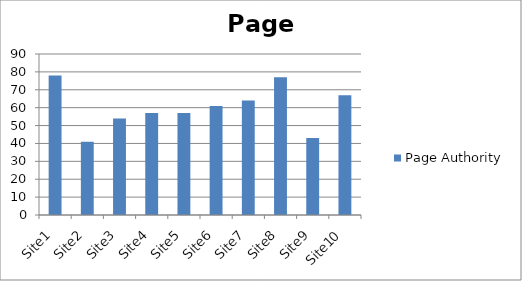
| Category | Page Authority |
|---|---|
| Site1 | 78 |
| Site2 | 41 |
| Site3 | 54 |
| Site4 | 57 |
| Site5 | 57 |
| Site6 | 61 |
| Site7 | 64 |
| Site8 | 77 |
| Site9 | 43 |
| Site10 | 67 |